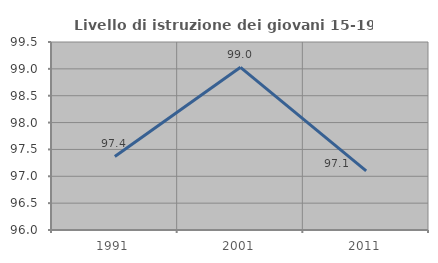
| Category | Livello di istruzione dei giovani 15-19 anni |
|---|---|
| 1991.0 | 97.368 |
| 2001.0 | 99.029 |
| 2011.0 | 97.101 |